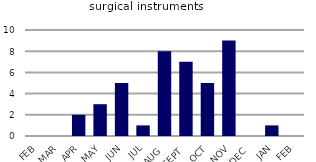
| Category | surgical instruments |
|---|---|
| FEB | 0 |
| MAR | 0 |
| APR | 2 |
| MAY | 3 |
| JUN | 5 |
| JUL | 1 |
| AUG | 8 |
| SEPT | 7 |
| OCT | 5 |
| NOV | 9 |
| DEC | 0 |
| JAN | 1 |
| FEB | 0 |